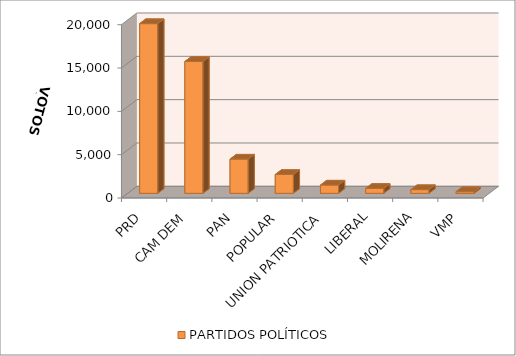
| Category | PARTIDOS POLÍTICOS |
|---|---|
| PRD | 19585 |
| CAM DEM | 15218 |
| PAN | 3950 |
| POPULAR | 2175 |
| UNION PATRIOTICA | 954 |
| LIBERAL | 570 |
| MOLIRENA | 428 |
| VMP | 196 |